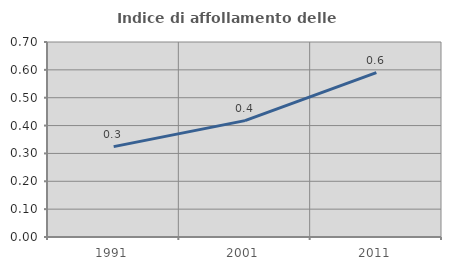
| Category | Indice di affollamento delle abitazioni  |
|---|---|
| 1991.0 | 0.324 |
| 2001.0 | 0.418 |
| 2011.0 | 0.59 |